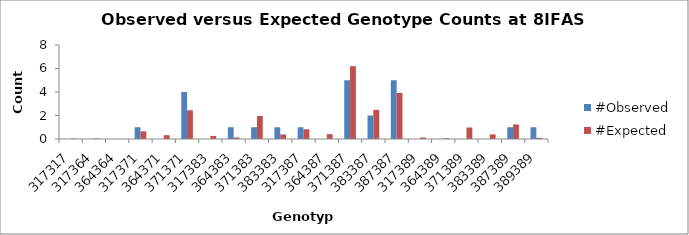
| Category | #Observed | #Expected |
|---|---|---|
| 317317.0 | 0 | 0.043 |
| 317364.0 | 0 | 0.043 |
| 364364.0 | 0 | 0.011 |
| 317371.0 | 1 | 0.652 |
| 364371.0 | 0 | 0.326 |
| 371371.0 | 4 | 2.446 |
| 317383.0 | 0 | 0.261 |
| 364383.0 | 1 | 0.13 |
| 371383.0 | 1 | 1.957 |
| 383383.0 | 1 | 0.391 |
| 317387.0 | 1 | 0.826 |
| 364387.0 | 0 | 0.413 |
| 371387.0 | 5 | 6.196 |
| 383387.0 | 2 | 2.478 |
| 387387.0 | 5 | 3.924 |
| 317389.0 | 0 | 0.13 |
| 364389.0 | 0 | 0.065 |
| 371389.0 | 0 | 0.978 |
| 383389.0 | 0 | 0.391 |
| 387389.0 | 1 | 1.239 |
| 389389.0 | 1 | 0.098 |